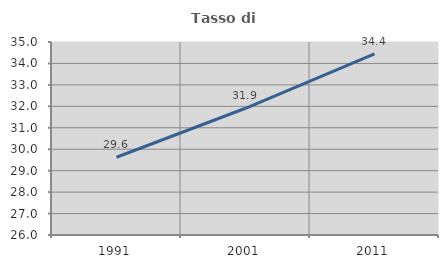
| Category | Tasso di occupazione   |
|---|---|
| 1991.0 | 29.625 |
| 2001.0 | 31.91 |
| 2011.0 | 34.446 |